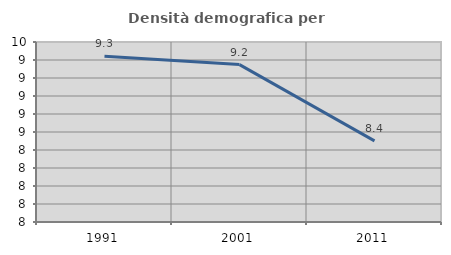
| Category | Densità demografica |
|---|---|
| 1991.0 | 9.341 |
| 2001.0 | 9.249 |
| 2011.0 | 8.402 |